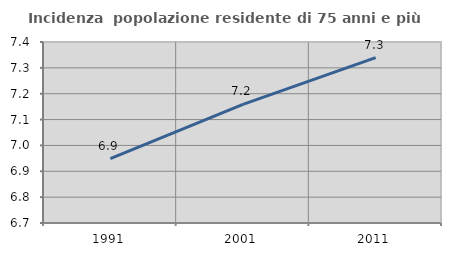
| Category | Incidenza  popolazione residente di 75 anni e più |
|---|---|
| 1991.0 | 6.949 |
| 2001.0 | 7.159 |
| 2011.0 | 7.339 |